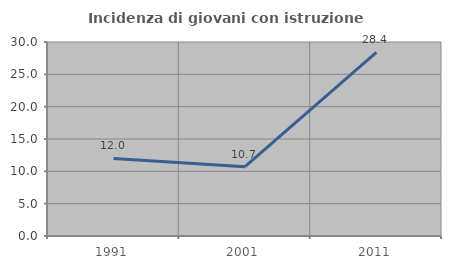
| Category | Incidenza di giovani con istruzione universitaria |
|---|---|
| 1991.0 | 12 |
| 2001.0 | 10.714 |
| 2011.0 | 28.409 |